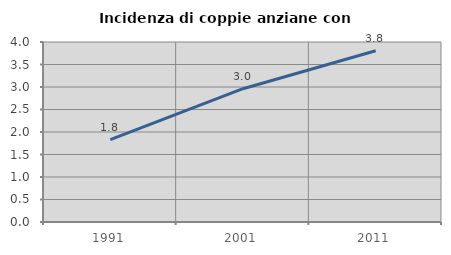
| Category | Incidenza di coppie anziane con figli |
|---|---|
| 1991.0 | 1.829 |
| 2001.0 | 2.962 |
| 2011.0 | 3.806 |